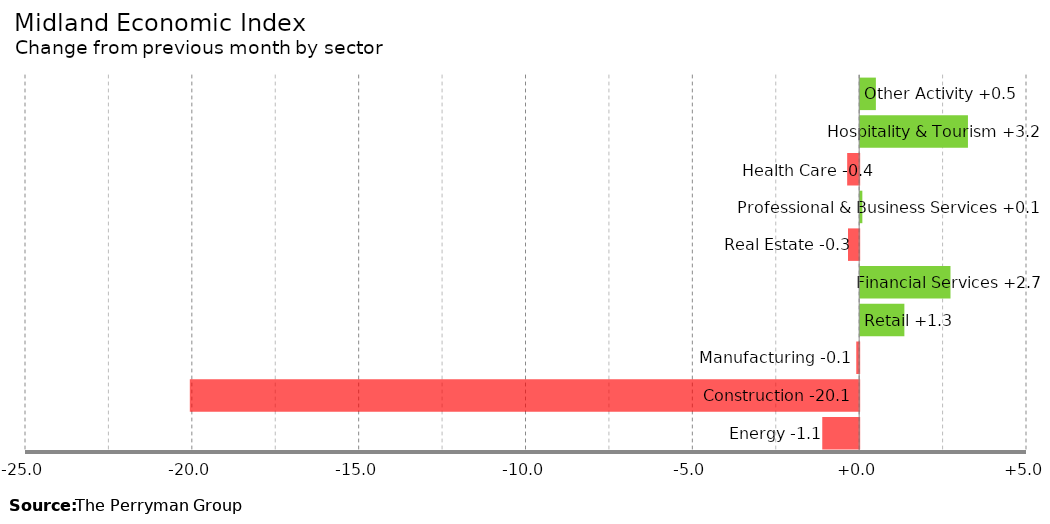
| Category | Change |
|---|---|
| Energy | -1.106 |
| Construction | -20.061 |
| Manufacturing | -0.087 |
| Retail | 1.325 |
| Financial Services | 2.707 |
| Real Estate | -0.335 |
| Professional & Business Services | 0.065 |
| Health Care | -0.36 |
| Hospitality & Tourism | 3.23 |
| Other Activity | 0.471 |